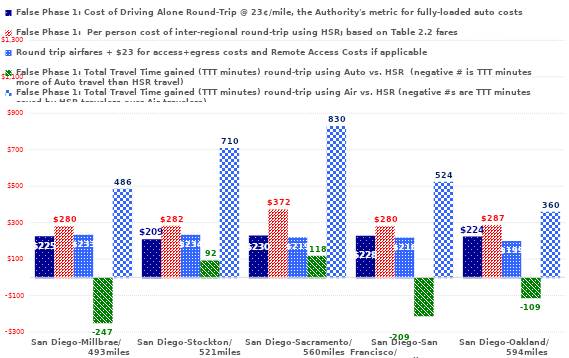
| Category | False Phase 1: Cost of Driving Alone Round-Trip @ 23¢/mile, the Authority's metric for fully-loaded auto costs | False Phase 1:  Per person cost of inter-regional round-trip using HSR; based on Table 2.2 fares | Round trip airfares + $23 for access+egress costs and Remote Access Costs if applicable | False Phase 1: Total Travel Time gained (TTT minutes) round-trip using Auto vs. HSR  (negative # is TTT minutes more of Auto travel than HSR travel) | False Phase 1: Total Travel Time gained (TTT minutes) round-trip using Air vs. HSR (negative #s are TTT minutes saved by HSR travelers over Air travelers) |
|---|---|---|---|---|---|
| San Diego-Millbrae/                      493miles | 225.4 | 280.3 | 233 | -246.5 | 486 |
| San Diego-Stockton/                        521miles | 208.84 | 282.3 | 234 | 92.3 | 710 |
| San Diego-Sacramento/                 560miles | 230 | 372.3 | 219 | 118 | 830 |
| San Diego-San Francisco/                         598miles | 228.16 | 280.3 | 218 | -208.5 | 524 |
| San Diego-Oakland/                594miles | 223.56 | 287.2 | 199 | -109.2 | 360 |